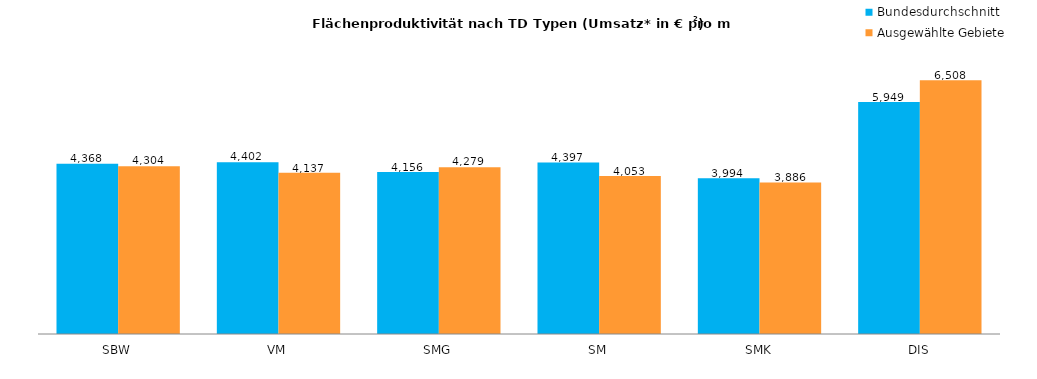
| Category |  Bundesdurchschnitt |  Ausgewählte Gebiete |
|---|---|---|
| SBW | 4367.648 | 4304.412 |
| VM | 4402.116 | 4136.582 |
| SMG | 4156.293 | 4278.71 |
| SM | 4397.313 | 4052.857 |
| SMK | 3993.716 | 3885.999 |
| DIS | 5949.354 | 6507.866 |